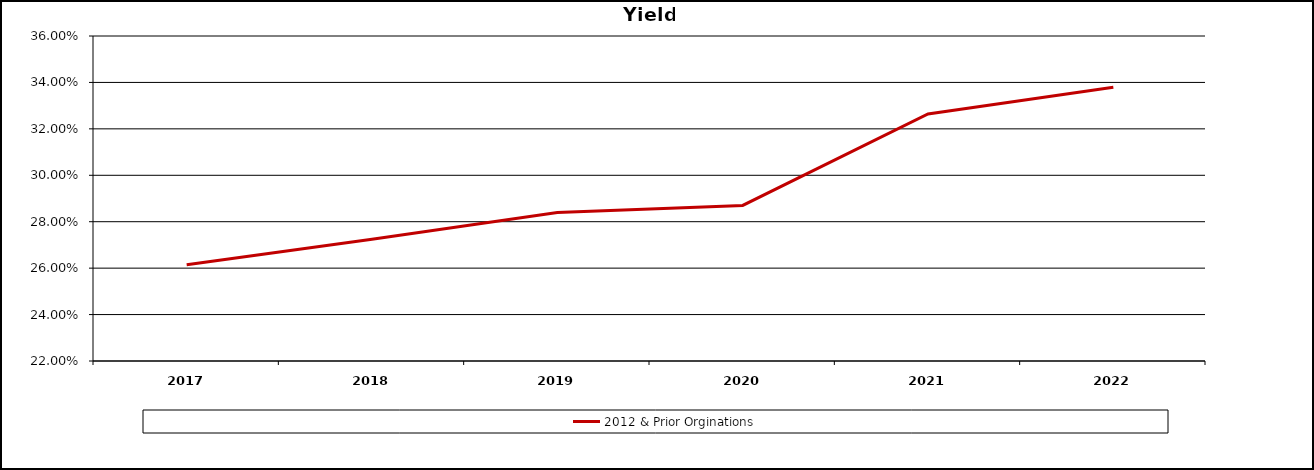
| Category | 2012 & Prior Orginations |
|---|---|
| 2017.0 | 0.262 |
| 2018.0 | 0.272 |
| 2019.0 | 0.284 |
| 2020.0 | 0.287 |
| 2021.0 | 0.326 |
| 44926.0 | 0.338 |